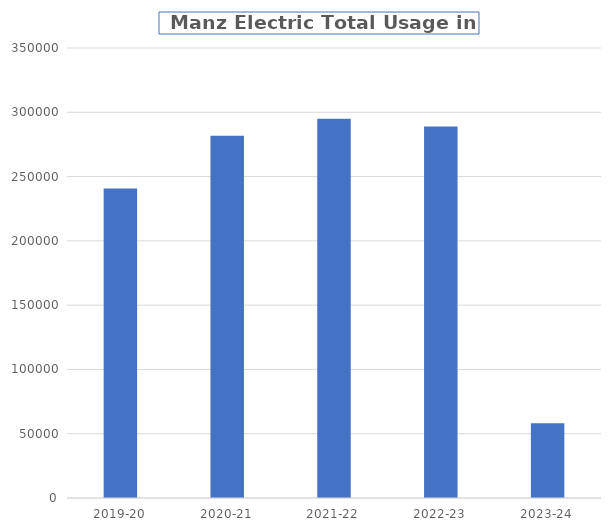
| Category | Series 0 |
|---|---|
| 2019-20 | 240730 |
| 2020-21 | 281803 |
| 2021-22 | 294988 |
| 2022-23 | 288936 |
| 2023-24 | 58184 |